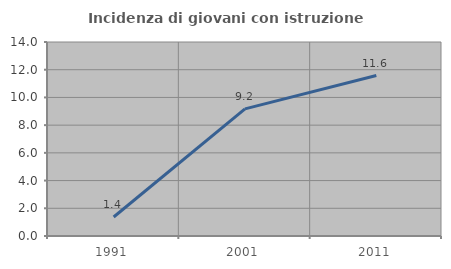
| Category | Incidenza di giovani con istruzione universitaria |
|---|---|
| 1991.0 | 1.37 |
| 2001.0 | 9.174 |
| 2011.0 | 11.579 |